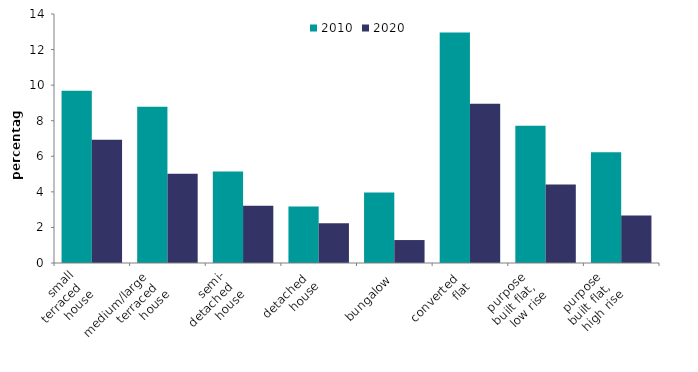
| Category | 2010 | 2020 |
|---|---|---|
| small
 terraced 
house | 9.687 | 6.935 |
| medium/large 
terraced 
house | 8.784 | 5.021 |
| semi-
detached 
house | 5.151 | 3.214 |
| detached 
house | 3.176 | 2.241 |
| bungalow | 3.963 | 1.291 |
| converted 
flat | 12.965 | 8.955 |
| purpose 
built flat, 
low rise | 7.72 | 4.413 |
| purpose 
built flat, 
high rise | 6.232 | 2.667 |